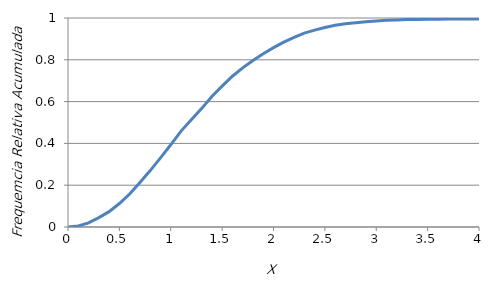
| Category | Series 0 |
|---|---|
| 0.0 | 0 |
| 0.1 | 0.005 |
| 0.2 | 0.02 |
| 0.30000000000000004 | 0.045 |
| 0.4 | 0.074 |
| 0.5 | 0.112 |
| 0.6 | 0.158 |
| 0.7 | 0.213 |
| 0.7999999999999999 | 0.27 |
| 0.8999999999999999 | 0.331 |
| 0.9999999999999999 | 0.393 |
| 1.0999999999999999 | 0.459 |
| 1.2 | 0.513 |
| 1.3 | 0.566 |
| 1.4000000000000001 | 0.625 |
| 1.5000000000000002 | 0.674 |
| 1.6000000000000003 | 0.721 |
| 1.7000000000000004 | 0.761 |
| 1.8000000000000005 | 0.797 |
| 1.9000000000000006 | 0.829 |
| 2.0000000000000004 | 0.858 |
| 2.1000000000000005 | 0.884 |
| 2.2000000000000006 | 0.907 |
| 2.3000000000000007 | 0.928 |
| 2.400000000000001 | 0.942 |
| 2.500000000000001 | 0.955 |
| 2.600000000000001 | 0.965 |
| 2.700000000000001 | 0.973 |
| 2.800000000000001 | 0.978 |
| 2.9000000000000012 | 0.982 |
| 3.0000000000000013 | 0.986 |
| 3.1000000000000014 | 0.989 |
| 3.2000000000000015 | 0.991 |
| 3.3000000000000016 | 0.992 |
| 3.4000000000000017 | 0.993 |
| 3.5000000000000018 | 0.994 |
| 3.600000000000002 | 0.995 |
| 3.700000000000002 | 0.995 |
| 3.800000000000002 | 0.996 |
| 3.900000000000002 | 0.996 |
| 4.000000000000002 | 0.996 |